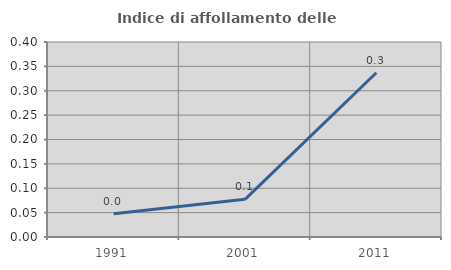
| Category | Indice di affollamento delle abitazioni  |
|---|---|
| 1991.0 | 0.047 |
| 2001.0 | 0.077 |
| 2011.0 | 0.337 |